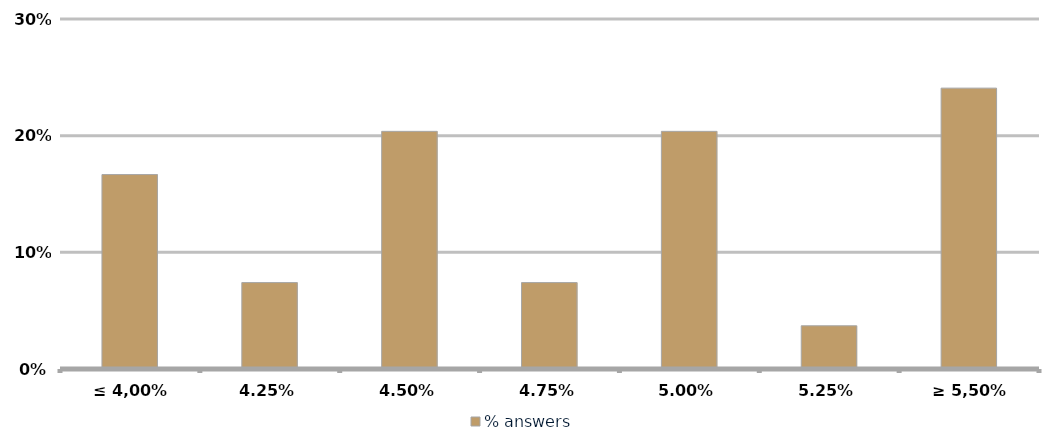
| Category | % answers |
|---|---|
| ≤ 4,00% | 0.167 |
| 4,25% | 0.074 |
| 4,50% | 0.204 |
| 4,75% | 0.074 |
| 5,00% | 0.204 |
| 5,25% | 0.037 |
| ≥ 5,50% | 0.241 |